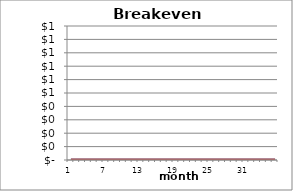
| Category | Series 0 | Series 1 |
|---|---|---|
| 0 | 0 | 0 |
| 1 | 0 | 0 |
| 2 | 0 | 0 |
| 3 | 0 | 0 |
| 4 | 0 | 0 |
| 5 | 0 | 0 |
| 6 | 0 | 0 |
| 7 | 0 | 0 |
| 8 | 0 | 0 |
| 9 | 0 | 0 |
| 10 | 0 | 0 |
| 11 | 0 | 0 |
| 12 | 0 | 0 |
| 13 | 0 | 0 |
| 14 | 0 | 0 |
| 15 | 0 | 0 |
| 16 | 0 | 0 |
| 17 | 0 | 0 |
| 18 | 0 | 0 |
| 19 | 0 | 0 |
| 20 | 0 | 0 |
| 21 | 0 | 0 |
| 22 | 0 | 0 |
| 23 | 0 | 0 |
| 24 | 0 | 0 |
| 25 | 0 | 0 |
| 26 | 0 | 0 |
| 27 | 0 | 0 |
| 28 | 0 | 0 |
| 29 | 0 | 0 |
| 30 | 0 | 0 |
| 31 | 0 | 0 |
| 32 | 0 | 0 |
| 33 | 0 | 0 |
| 34 | 0 | 0 |
| 35 | 0 | 0 |